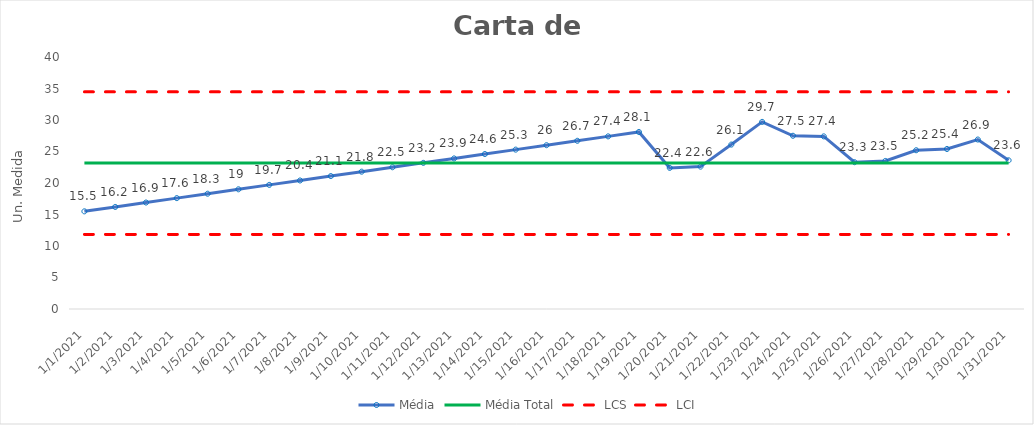
| Category | Média | Média Total | LCS | LCI |
|---|---|---|---|---|
| 01/01/2021 | 15.5 | 23.155 | 34.474 | 11.836 |
| 02/01/2021 | 16.2 | 23.155 | 34.474 | 11.836 |
| 03/01/2021 | 16.9 | 23.155 | 34.474 | 11.836 |
| 04/01/2021 | 17.6 | 23.155 | 34.474 | 11.836 |
| 05/01/2021 | 18.3 | 23.155 | 34.474 | 11.836 |
| 06/01/2021 | 19 | 23.155 | 34.474 | 11.836 |
| 07/01/2021 | 19.7 | 23.155 | 34.474 | 11.836 |
| 08/01/2021 | 20.4 | 23.155 | 34.474 | 11.836 |
| 09/01/2021 | 21.1 | 23.155 | 34.474 | 11.836 |
| 10/01/2021 | 21.8 | 23.155 | 34.474 | 11.836 |
| 11/01/2021 | 22.5 | 23.155 | 34.474 | 11.836 |
| 12/01/2021 | 23.2 | 23.155 | 34.474 | 11.836 |
| 13/01/2021 | 23.9 | 23.155 | 34.474 | 11.836 |
| 14/01/2021 | 24.6 | 23.155 | 34.474 | 11.836 |
| 15/01/2021 | 25.3 | 23.155 | 34.474 | 11.836 |
| 16/01/2021 | 26 | 23.155 | 34.474 | 11.836 |
| 17/01/2021 | 26.7 | 23.155 | 34.474 | 11.836 |
| 18/01/2021 | 27.4 | 23.155 | 34.474 | 11.836 |
| 19/01/2021 | 28.1 | 23.155 | 34.474 | 11.836 |
| 20/01/2021 | 22.4 | 23.155 | 34.474 | 11.836 |
| 21/01/2021 | 22.6 | 23.155 | 34.474 | 11.836 |
| 22/01/2021 | 26.1 | 23.155 | 34.474 | 11.836 |
| 23/01/2021 | 29.7 | 23.155 | 34.474 | 11.836 |
| 24/01/2021 | 27.5 | 23.155 | 34.474 | 11.836 |
| 25/01/2021 | 27.4 | 23.155 | 34.474 | 11.836 |
| 26/01/2021 | 23.3 | 23.155 | 34.474 | 11.836 |
| 27/01/2021 | 23.5 | 23.155 | 34.474 | 11.836 |
| 28/01/2021 | 25.2 | 23.155 | 34.474 | 11.836 |
| 29/01/2021 | 25.4 | 23.155 | 34.474 | 11.836 |
| 30/01/2021 | 26.9 | 23.155 | 34.474 | 11.836 |
| 31/01/2021 | 23.6 | 23.155 | 34.474 | 11.836 |